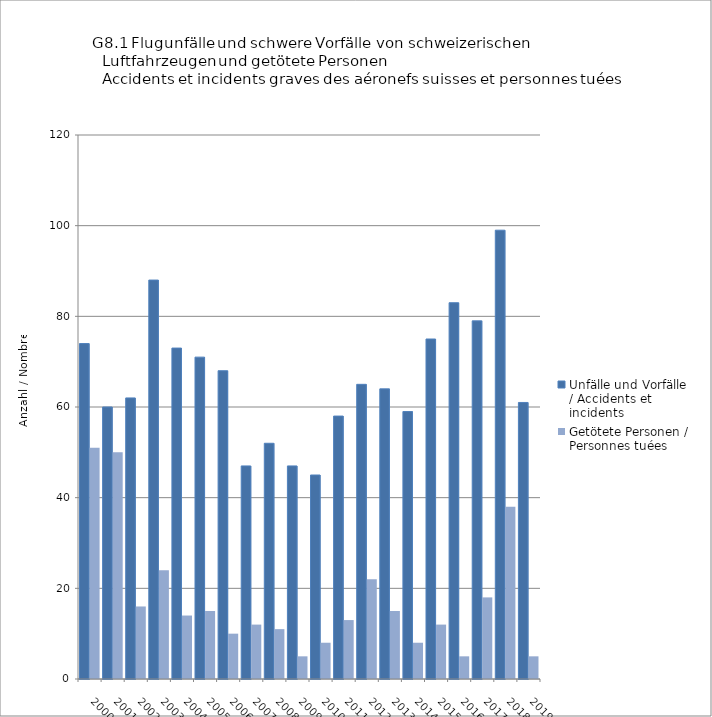
| Category | Unfälle und Vorfälle / Accidents et incidents | Getötete Personen / Personnes tuées |
|---|---|---|
| 2000.0 | 74 | 51 |
| 2001.0 | 60 | 50 |
| 2002.0 | 62 | 16 |
| 2003.0 | 88 | 24 |
| 2004.0 | 73 | 14 |
| 2005.0 | 71 | 15 |
| 2006.0 | 68 | 10 |
| 2007.0 | 47 | 12 |
| 2008.0 | 52 | 11 |
| 2009.0 | 47 | 5 |
| 2010.0 | 45 | 8 |
| 2011.0 | 58 | 13 |
| 2012.0 | 65 | 22 |
| 2013.0 | 64 | 15 |
| 2014.0 | 59 | 8 |
| 2015.0 | 75 | 12 |
| 2016.0 | 83 | 5 |
| 2017.0 | 79 | 18 |
| 2018.0 | 99 | 38 |
| 2019.0 | 61 | 5 |